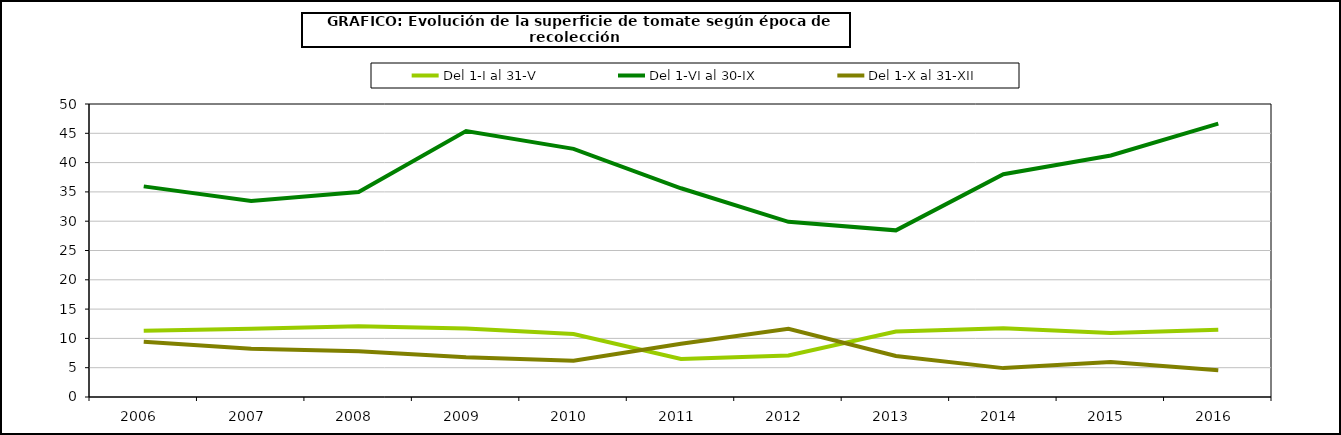
| Category | Del 1-I al 31-V | Del 1-VI al 30-IX | Del 1-X al 31-XII |
|---|---|---|---|
| 2006.0 | 11.312 | 35.942 | 9.436 |
| 2007.0 | 11.626 | 33.45 | 8.221 |
| 2008.0 | 12.07 | 34.991 | 7.807 |
| 2009.0 | 11.671 | 45.383 | 6.784 |
| 2010.0 | 10.742 | 42.349 | 6.176 |
| 2011.0 | 6.491 | 35.62 | 9.093 |
| 2012.0 | 7.086 | 29.889 | 11.641 |
| 2013.0 | 11.18 | 28.439 | 7.005 |
| 2014.0 | 11.722 | 38.024 | 4.929 |
| 2015.0 | 10.934 | 41.208 | 5.992 |
| 2016.0 | 11.479 | 46.659 | 4.577 |